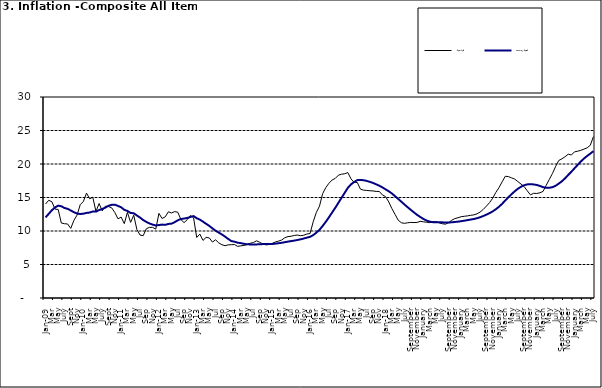
| Category | Year-on Rate | 12-Month Average |
|---|---|---|
| Jan-09 | 14.034 | 12.032 |
| Feb | 14.584 | 12.567 |
| Mar | 14.366 | 13.101 |
| Apr | 13.268 | 13.51 |
| May | 13.212 | 13.787 |
| June | 11.194 | 13.694 |
| July | 11.09 | 13.437 |
| Aug | 11.046 | 13.307 |
| Sept | 10.39 | 13.065 |
| Oct | 11.588 | 12.803 |
| Nov | 12.368 | 12.609 |
| Dec | 13.93 | 12.538 |
| Jan-10 | 14.398 | 12.586 |
| Feb | 15.649 | 12.7 |
| Mar | 14.812 | 12.757 |
| Apr | 15.044 | 12.915 |
| May | 12.915 | 12.893 |
| June | 14.099 | 13.132 |
| July | 13.002 | 13.284 |
| Aug | 13.702 | 13.5 |
| Sept | 13.65 | 13.764 |
| Oct | 13.45 | 13.908 |
| Nov | 12.766 | 13.928 |
| Dec | 11.815 | 13.74 |
| Jan-11 | 12.08 | 13.542 |
| Feb | 11.1 | 13.161 |
| Mar | 12.779 | 13.001 |
| Apr | 11.291 | 12.694 |
| May | 12.352 | 12.648 |
| Jun | 10.23 | 12.321 |
| Jul | 9.397 | 12.009 |
| Aug | 9.301 | 11.635 |
| Sep | 10.339 | 11.363 |
| Oct | 10.544 | 11.13 |
| Nov | 10.54 | 10.952 |
| Dec | 10.283 | 10.826 |
| Jan-12 | 12.626 | 10.886 |
| Feb | 11.866 | 10.955 |
| Mar | 12.111 | 10.914 |
| Apr | 12.866 | 11.054 |
| May | 12.688 | 11.096 |
| Jun | 12.892 | 11.32 |
| Jul | 12.797 | 11.599 |
| Aug | 11.689 | 11.791 |
| Sep | 11.253 | 11.859 |
| Oct | 11.693 | 11.948 |
| Nov | 12.32 | 12.091 |
| Dec | 11.981 | 12.224 |
| Jan-13 | 9.031 | 11.908 |
| Feb | 9.542 | 11.703 |
| Mar | 8.593 | 11.394 |
| Apr | 9.052 | 11.072 |
| May | 8.964 | 10.761 |
| Jun | 8.353 | 10.383 |
| Jul | 8.682 | 10.047 |
| Aug | 8.231 | 9.761 |
| Sep | 7.952 | 9.486 |
| Oct | 7.807 | 9.167 |
| Nov | 7.931 | 8.815 |
| Dec | 7.957 | 8.496 |
| Jan-14 | 7.977 | 8.408 |
| Feb | 7.707 | 8.257 |
| Mar | 7.783 | 8.19 |
| Apr | 7.851 | 8.092 |
| May | 7.965 | 8.012 |
| Jun | 8.167 | 7.998 |
| Jul | 8.281 | 7.968 |
| Aug | 8.534 | 7.996 |
| Sep | 8.317 | 8.027 |
| Oct | 8.06 | 8.047 |
| Nov | 7.927 | 8.046 |
| Dec | 7.978 | 8.047 |
| Jan-15 | 8.157 | 8.063 |
| Feb | 8.359 | 8.117 |
| Mar | 8.494 | 8.176 |
| Apr | 8.655 | 8.243 |
| May | 9.003 | 8.331 |
| Jun | 9.168 | 8.417 |
| Jul | 9.218 | 8.497 |
| Aug | 9.336 | 8.566 |
| Sep | 9.394 | 8.658 |
| Oct | 9.296 | 8.76 |
| Nov | 9.368 | 8.879 |
| Dec | 9.554 | 9.009 |
| Jan-16 | 9.617 | 9.13 |
| Feb | 11.379 | 9.386 |
| Mar | 12.775 | 9.751 |
| Apr | 13.721 | 10.182 |
| May | 15.577 | 10.746 |
| Jun | 16.48 | 11.372 |
| Jul | 17.127 | 12.045 |
| Aug | 17.609 | 12.744 |
| Sep | 17.852 | 13.454 |
| Oct | 18.33 | 14.206 |
| Nov | 18.476 | 14.958 |
| Dec | 18.547 | 15.697 |
| Jan-17 | 18.719 | 16.441 |
| Feb | 17.78 | 16.958 |
| Mar | 17.256 | 17.315 |
| Apr | 17.244 | 17.591 |
| May | 16.251 | 17.628 |
| Jun | 16.098 | 17.578 |
| Jul | 16.053 | 17.475 |
| Aug | 16.012 | 17.331 |
| Sep | 15.979 | 17.17 |
| Oct | 15.905 | 16.968 |
| Nov | 15.901 | 16.76 |
| Dec | 15.372 | 16.502 |
| Jan-18 | 15.127 | 16.215 |
| Feb | 14.33 | 15.93 |
| Mar | 13.337 | 15.599 |
| Apr | 12.482 | 15.196 |
| May | 11.608 | 14.793 |
| June | 11.231 | 14.371 |
| July | 11.142 | 13.95 |
| August | 11.227 | 13.546 |
| September | 11.284 | 13.157 |
| October | 11.259 | 12.777 |
| November | 11.281 | 12.406 |
| December | 11.442 | 12.095 |
| January | 11.374 | 11.801 |
| February | 11.306 | 11.564 |
| March | 11.251 | 11.401 |
| April | 11.372 | 11.314 |
| May | 11.396 | 11.299 |
| June | 11.217 | 11.297 |
| July | 11.084 | 11.291 |
| August | 11.016 | 11.271 |
| September | 11.244 | 11.268 |
| October | 11.607 | 11.298 |
| November | 11.854 | 11.348 |
| December | 11.982 | 11.396 |
| January | 12.132 | 11.462 |
| February | 12.199 | 11.539 |
| March | 12.257 | 11.624 |
| April | 12.341 | 11.706 |
| May | 12.404 | 11.791 |
| June | 12.559 | 11.904 |
| July | 12.821 | 12.049 |
| August | 13.22 | 12.233 |
| September | 13.707 | 12.44 |
| October | 14.233 | 12.664 |
| November | 14.887 | 12.923 |
| December | 15.753 | 13.246 |
| January | 16.466 | 13.616 |
| February | 17.335 | 14.053 |
| March | 18.171 | 14.554 |
| April | 18.117 | 15.039 |
| May | 17.933 | 15.499 |
| June | 17.751 | 15.927 |
| July | 17.377 | 16.298 |
| August | 17.009 | 16.601 |
| September | 16.63 | 16.83 |
| October | 15.994 | 16.958 |
| November | 15.396 | 16.979 |
| December | 15.625 | 16.953 |
| January | 15.601 | 16.869 |
| February | 15.702 | 16.728 |
| March | 15.915 | 16.544 |
| April | 16.819 | 16.449 |
| May | 17.712 | 16.449 |
| June | 18.596 | 16.542 |
| July | 19.643 | 16.755 |
| August | 20.525 | 17.07 |
| September | 20.774 | 17.432 |
| October | 21.087 | 17.865 |
| November | 21.466 | 18.372 |
| December | 21.344 | 18.847 |
| January | 21.816 | 19.362 |
| February | 21.91 | 19.873 |
| March | 22.043 | 20.375 |
| April | 22.222 | 20.816 |
| May | 22.413 | 21.2 |
| June | 22.789 | 21.544 |
| July | 24.08 | 21.92 |